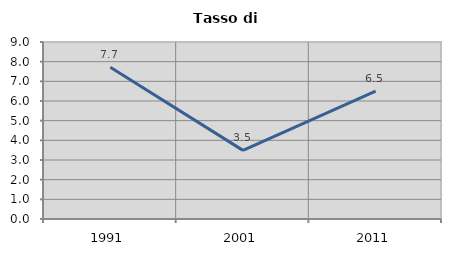
| Category | Tasso di disoccupazione   |
|---|---|
| 1991.0 | 7.716 |
| 2001.0 | 3.488 |
| 2011.0 | 6.504 |